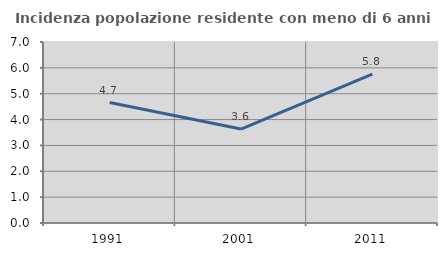
| Category | Incidenza popolazione residente con meno di 6 anni |
|---|---|
| 1991.0 | 4.659 |
| 2001.0 | 3.633 |
| 2011.0 | 5.76 |